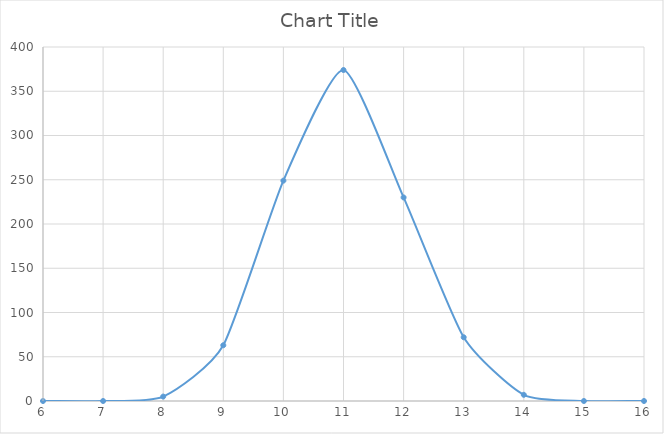
| Category | Series 0 |
|---|---|
| 1.0 | 0 |
| 2.0 | 0 |
| 3.0 | 0 |
| 4.0 | 0 |
| 5.0 | 0 |
| 6.0 | 0 |
| 7.0 | 0 |
| 8.0 | 5 |
| 9.0 | 63 |
| 10.0 | 249 |
| 11.0 | 374 |
| 12.0 | 230 |
| 13.0 | 72 |
| 14.0 | 7 |
| 15.0 | 0 |
| 16.0 | 0 |
| 17.0 | 0 |
| 18.0 | 0 |
| 19.0 | 0 |
| 20.0 | 0 |